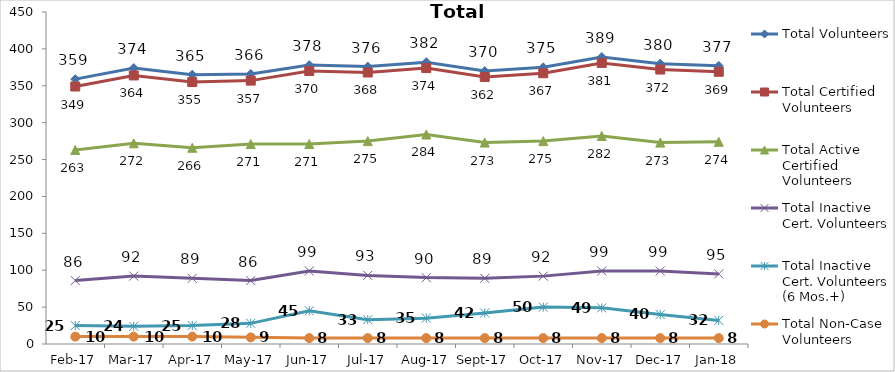
| Category | Total Volunteers | Total Certified Volunteers | Total Active Certified Volunteers | Total Inactive Cert. Volunteers | Total Inactive Cert. Volunteers (6 Mos.+) | Total Non-Case Volunteers |
|---|---|---|---|---|---|---|
| 2017-02-01 | 359 | 349 | 263 | 86 | 25 | 10 |
| 2017-03-01 | 374 | 364 | 272 | 92 | 24 | 10 |
| 2017-04-01 | 365 | 355 | 266 | 89 | 25 | 10 |
| 2017-05-01 | 366 | 357 | 271 | 86 | 28 | 9 |
| 2017-06-01 | 378 | 370 | 271 | 99 | 45 | 8 |
| 2017-07-01 | 376 | 368 | 275 | 93 | 33 | 8 |
| 2017-08-01 | 382 | 374 | 284 | 90 | 35 | 8 |
| 2017-09-01 | 370 | 362 | 273 | 89 | 42 | 8 |
| 2017-10-01 | 375 | 367 | 275 | 92 | 50 | 8 |
| 2017-11-01 | 389 | 381 | 282 | 99 | 49 | 8 |
| 2017-12-01 | 380 | 372 | 273 | 99 | 40 | 8 |
| 2018-01-01 | 377 | 369 | 274 | 95 | 32 | 8 |